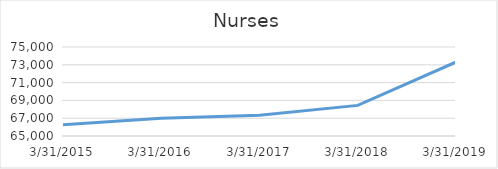
| Category | Nurses |
|---|---|
| 3/31/15 | 66251 |
| 3/31/16 | 66993 |
| 3/31/17 | 67345 |
| 3/31/18 | 68438 |
| 3/31/19 | 73308 |